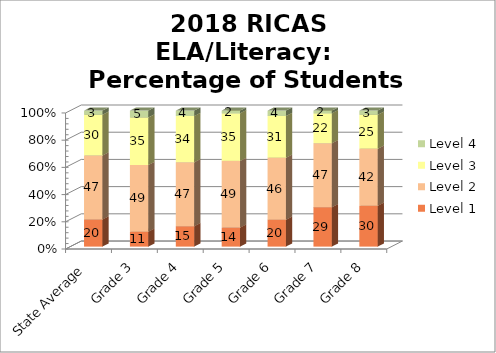
| Category | Level 1 | Level 2 | Level 3 | Level 4 |
|---|---|---|---|---|
| State Average | 20 | 47 | 30 | 3 |
| Grade 3 | 11 | 49 | 35 | 5 |
| Grade 4 | 15 | 47 | 34 | 4 |
| Grade 5 | 14 | 49 | 35 | 2 |
| Grade 6 | 20 | 46 | 31 | 4 |
| Grade 7 | 29 | 47 | 22 | 2 |
| Grade 8 | 30 | 42 | 25 | 3 |